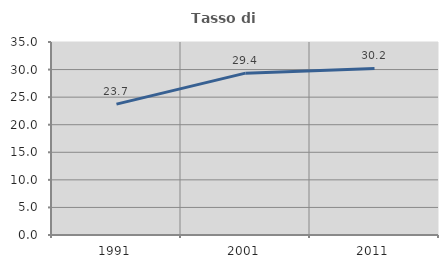
| Category | Tasso di occupazione   |
|---|---|
| 1991.0 | 23.729 |
| 2001.0 | 29.353 |
| 2011.0 | 30.2 |